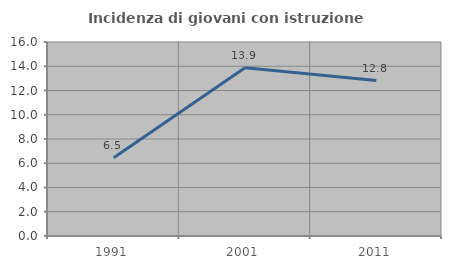
| Category | Incidenza di giovani con istruzione universitaria |
|---|---|
| 1991.0 | 6.452 |
| 2001.0 | 13.869 |
| 2011.0 | 12.821 |